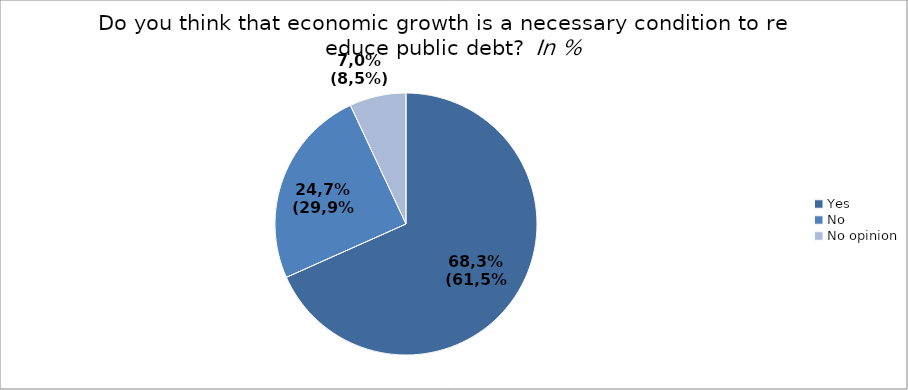
| Category | Dynamic consolidation Do you think that economic growth is a necessary condition to reduce public debt? In % |
|---|---|
| Yes | 0.683 |
| No | 0.247 |
| No opinion | 0.07 |